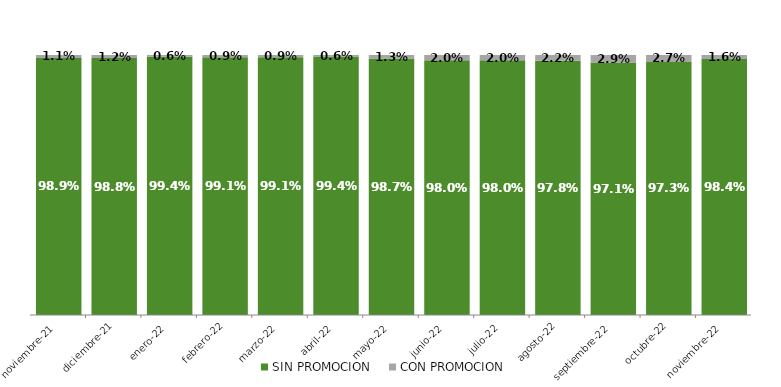
| Category | SIN PROMOCION   | CON PROMOCION   |
|---|---|---|
| 2021-11-01 | 0.989 | 0.011 |
| 2021-12-01 | 0.988 | 0.012 |
| 2022-01-01 | 0.994 | 0.006 |
| 2022-02-01 | 0.991 | 0.009 |
| 2022-03-01 | 0.991 | 0.009 |
| 2022-04-01 | 0.994 | 0.006 |
| 2022-05-01 | 0.987 | 0.013 |
| 2022-06-01 | 0.98 | 0.02 |
| 2022-07-01 | 0.98 | 0.02 |
| 2022-08-01 | 0.978 | 0.022 |
| 2022-09-01 | 0.971 | 0.029 |
| 2022-10-01 | 0.973 | 0.027 |
| 2022-11-01 | 0.984 | 0.016 |